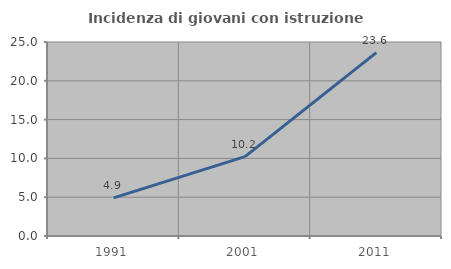
| Category | Incidenza di giovani con istruzione universitaria |
|---|---|
| 1991.0 | 4.916 |
| 2001.0 | 10.22 |
| 2011.0 | 23.624 |